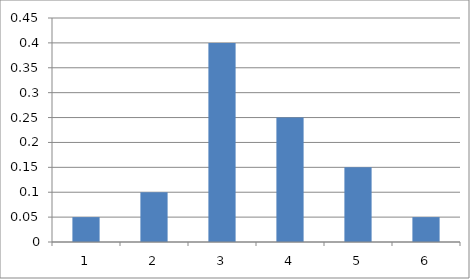
| Category | Series 0 |
|---|---|
| 0 | 0.05 |
| 1 | 0.1 |
| 2 | 0.4 |
| 3 | 0.25 |
| 4 | 0.15 |
| 5 | 0.05 |